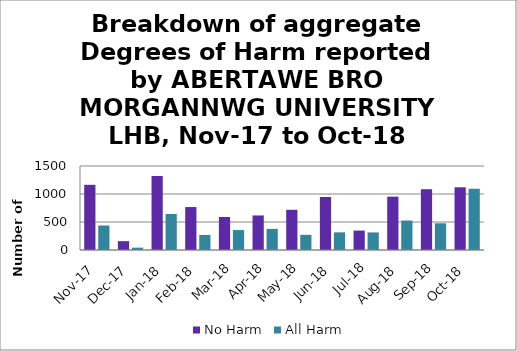
| Category | No Harm | All Harm |
|---|---|---|
| Nov-17 | 1164 | 437 |
| Dec-17 | 158 | 42 |
| Jan-18 | 1321 | 644 |
| Feb-18 | 767 | 269 |
| Mar-18 | 589 | 356 |
| Apr-18 | 617 | 377 |
| May-18 | 718 | 271 |
| Jun-18 | 946 | 315 |
| Jul-18 | 347 | 314 |
| Aug-18 | 953 | 526 |
| Sep-18 | 1085 | 477 |
| Oct-18 | 1120 | 1094 |